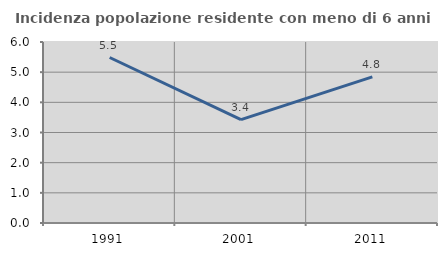
| Category | Incidenza popolazione residente con meno di 6 anni |
|---|---|
| 1991.0 | 5.486 |
| 2001.0 | 3.426 |
| 2011.0 | 4.844 |